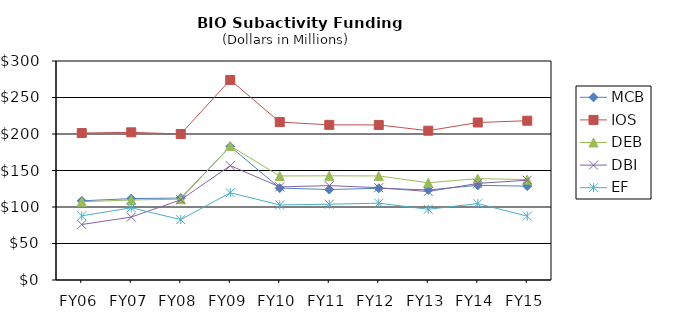
| Category | MCB | IOS | DEB | DBI | EF |
|---|---|---|---|---|---|
| FY06 | 108.46 | 201.34 | 107.21 | 76.02 | 87.87 |
| FY07 | 111.5 | 202.31 | 109.6 | 86.21 | 98.92 |
| FY08 | 112.28 | 200.04 | 110.71 | 109.86 | 82.73 |
| FY09 | 182.81 | 274.05 | 183.6 | 156.69 | 119.48 |
| FY10 | 125.9 | 216.32 | 142.5 | 127.54 | 102.85 |
| FY11 | 123.93 | 212.56 | 142.72 | 129.28 | 103.79 |
| FY12 | 125.63 | 212.43 | 142.55 | 126.46 | 105.22 |
| FY13 | 123.4 | 204.5 | 133.26 | 121.16 | 96.89 |
| FY14 | 129.68 | 215.74 | 138.87 | 132.33 | 104.65 |
| FY15 | 128.58 | 218.19 | 137.52 | 136.67 | 87.56 |